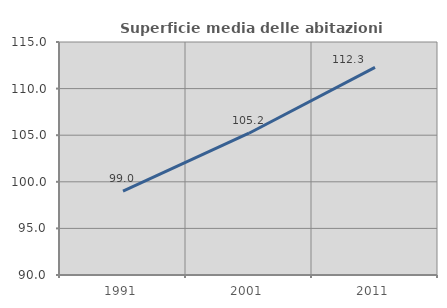
| Category | Superficie media delle abitazioni occupate |
|---|---|
| 1991.0 | 99.008 |
| 2001.0 | 105.213 |
| 2011.0 | 112.269 |